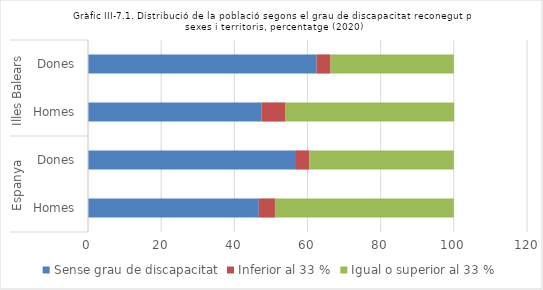
| Category | Sense grau de discapacitat | Inferior al 33 % | Igual o superior al 33 % |
|---|---|---|---|
| 0 | 46.7 | 4.4 | 48.9 |
| 1 | 56.6 | 3.9 | 39.5 |
| 2 | 47.4 | 6.6 | 46.1 |
| 3 | 62.5 | 3.8 | 33.7 |